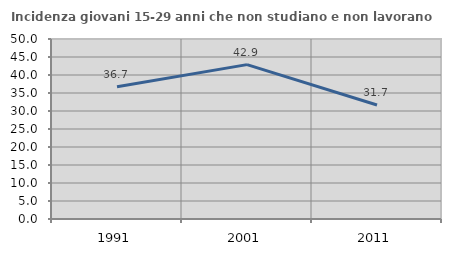
| Category | Incidenza giovani 15-29 anni che non studiano e non lavorano  |
|---|---|
| 1991.0 | 36.719 |
| 2001.0 | 42.887 |
| 2011.0 | 31.66 |